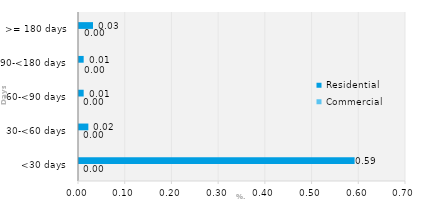
| Category | Commercial | Residential |
|---|---|---|
| <30 days | 0 | 0.59 |
| 30-<60 days | 0 | 0.02 |
| 60-<90 days | 0 | 0.01 |
| 90-<180 days | 0 | 0.01 |
| >= 180 days | 0 | 0.03 |